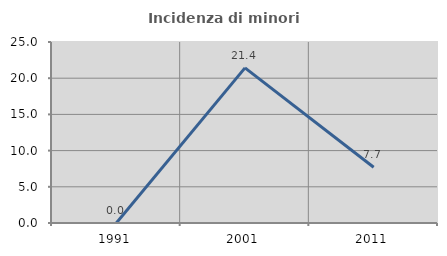
| Category | Incidenza di minori stranieri |
|---|---|
| 1991.0 | 0 |
| 2001.0 | 21.429 |
| 2011.0 | 7.692 |